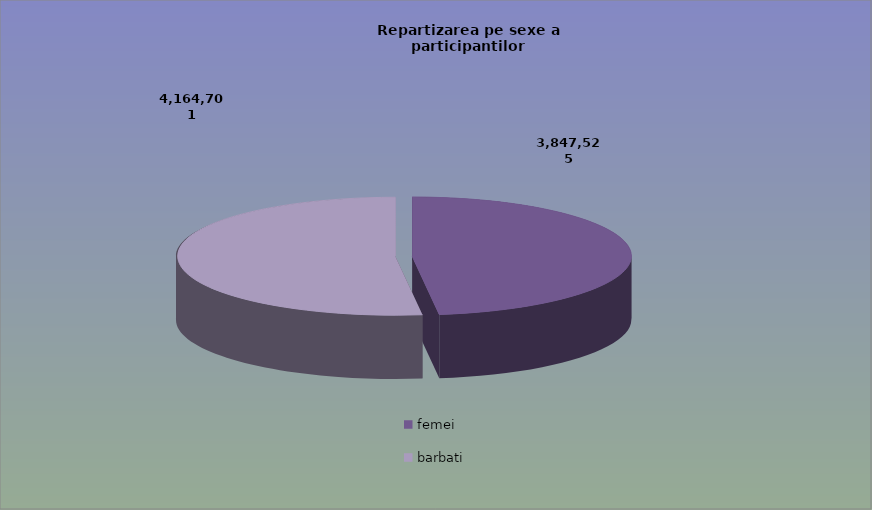
| Category | Series 0 |
|---|---|
| femei | 3847525 |
| barbati | 4164701 |